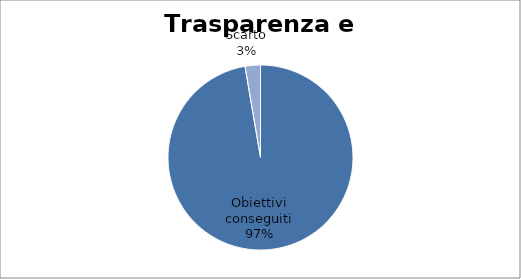
| Category | Series 0 |
|---|---|
| Obiettivi conseguiti | 97.318 |
| Scarto | 2.682 |